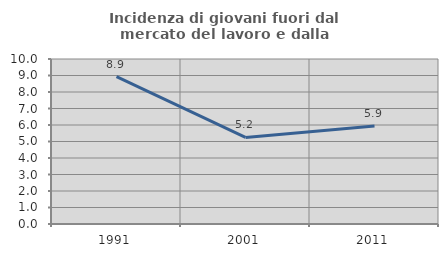
| Category | Incidenza di giovani fuori dal mercato del lavoro e dalla formazione  |
|---|---|
| 1991.0 | 8.933 |
| 2001.0 | 5.245 |
| 2011.0 | 5.941 |